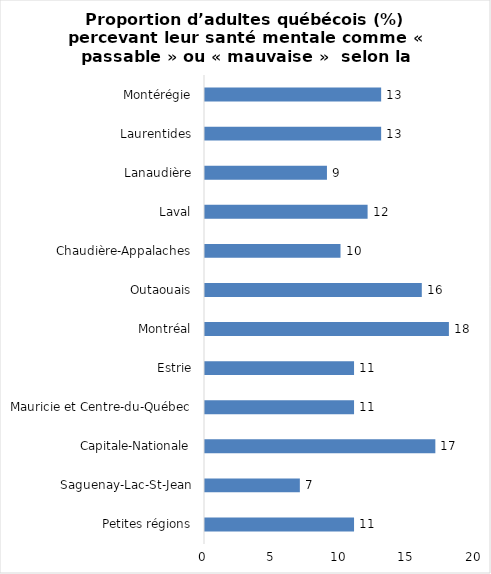
| Category | Series 0 |
|---|---|
| Petites régions | 11 |
| Saguenay-Lac-St-Jean | 7 |
| Capitale-Nationale | 17 |
| Mauricie et Centre-du-Québec | 11 |
| Estrie | 11 |
| Montréal | 18 |
| Outaouais | 16 |
| Chaudière-Appalaches | 10 |
| Laval | 12 |
| Lanaudière | 9 |
| Laurentides | 13 |
| Montérégie | 13 |